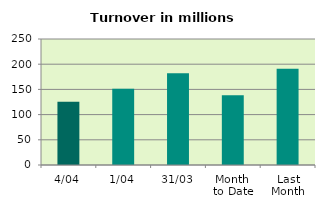
| Category | Series 0 |
|---|---|
| 4/04 | 125.671 |
| 1/04 | 151.181 |
| 31/03 | 181.88 |
| Month 
to Date | 138.426 |
| Last
Month | 190.797 |